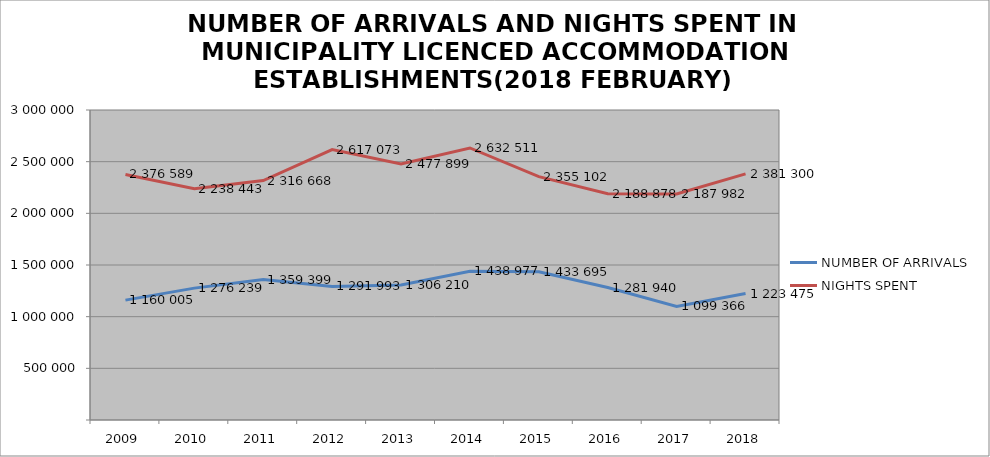
| Category | NUMBER OF ARRIVALS | NIGHTS SPENT |
|---|---|---|
| 2009 | 1160005 | 2376589 |
| 2010 | 1276239 | 2238443 |
| 2011 | 1359399 | 2316668 |
| 2012 | 1291993 | 2617073 |
| 2013 | 1306210 | 2477899 |
| 2014 | 1438977 | 2632511 |
| 2015 | 1433695 | 2355102 |
| 2016 | 1281940 | 2188878 |
| 2017 | 1099366 | 2187982 |
| 2018 | 1223475 | 2381300 |